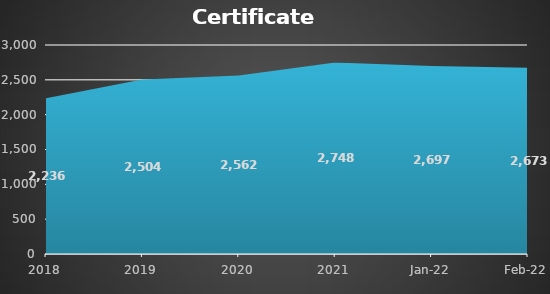
| Category | Certificate holders |
|---|---|
| 2018.0 | 2236 |
| 2019.0 | 2504 |
| 2020.0 | 2562 |
| 2021.0 | 2748 |
| 44592.0 | 2697 |
| 44620.0 | 2673 |